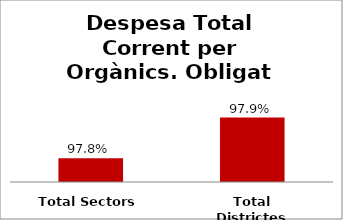
| Category | Series 0 |
|---|---|
| Total Sectors | 0.978 |
| Total Districtes | 0.979 |